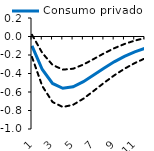
| Category | Series 0 | Consumo privado | Series 2 |
|---|---|---|---|
| 1.0 | 0.018 | -0.102 | -0.222 |
| 2.0 | -0.178 | -0.357 | -0.536 |
| 3.0 | -0.307 | -0.508 | -0.708 |
| 4.0 | -0.358 | -0.56 | -0.762 |
| 5.0 | -0.349 | -0.544 | -0.739 |
| 6.0 | -0.304 | -0.488 | -0.673 |
| 7.0 | -0.244 | -0.416 | -0.589 |
| 8.0 | -0.183 | -0.342 | -0.502 |
| 9.0 | -0.127 | -0.274 | -0.421 |
| 10.0 | -0.081 | -0.215 | -0.349 |
| 11.0 | -0.044 | -0.166 | -0.287 |
| 12.0 | -0.017 | -0.126 | -0.236 |